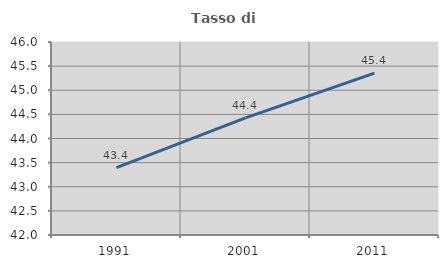
| Category | Tasso di occupazione   |
|---|---|
| 1991.0 | 43.398 |
| 2001.0 | 44.427 |
| 2011.0 | 45.354 |